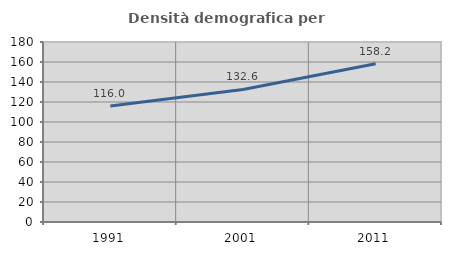
| Category | Densità demografica |
|---|---|
| 1991.0 | 115.966 |
| 2001.0 | 132.574 |
| 2011.0 | 158.206 |